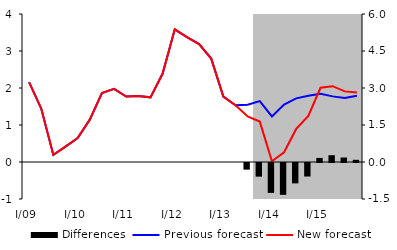
| Category | Differences |
|---|---|
| 0 | 0 |
| 1 | 0 |
| 2 | 0 |
| 3 | 0 |
| 4 | 0 |
| 5 | 0 |
| 6 | 0 |
| 7 | 0 |
| 8 | 0 |
| 9 | 0 |
| 10 | 0 |
| 11 | 0 |
| 12 | 0 |
| 13 | 0 |
| 14 | 0 |
| 15 | 0 |
| 16 | 0 |
| 17 | 0 |
| 18 | -0.268 |
| 19 | -0.553 |
| 20 | -1.212 |
| 21 | -1.29 |
| 22 | -0.827 |
| 23 | -0.548 |
| 24 | 0.165 |
| 25 | 0.275 |
| 26 | 0.181 |
| 27 | 0.089 |